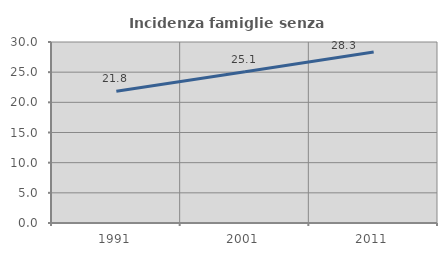
| Category | Incidenza famiglie senza nuclei |
|---|---|
| 1991.0 | 21.82 |
| 2001.0 | 25.059 |
| 2011.0 | 28.328 |